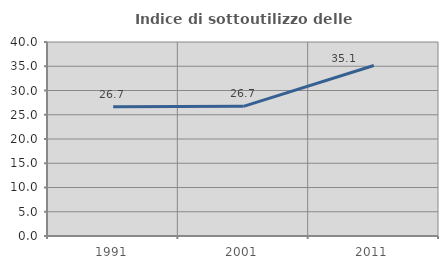
| Category | Indice di sottoutilizzo delle abitazioni  |
|---|---|
| 1991.0 | 26.667 |
| 2001.0 | 26.73 |
| 2011.0 | 35.149 |